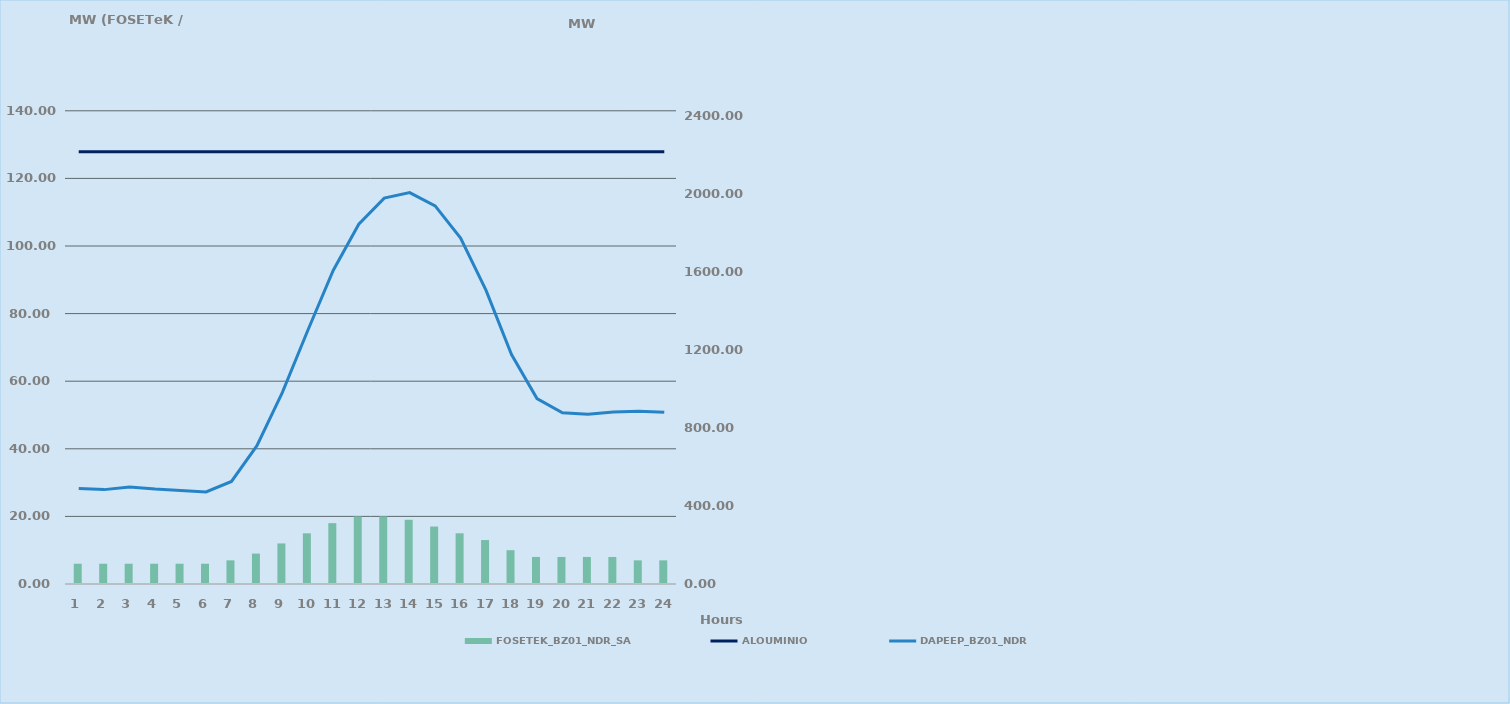
| Category | FOSETEK_BZ01_NDR_SA |
|---|---|
| 0 | 6 |
| 1 | 6 |
| 2 | 6 |
| 3 | 6 |
| 4 | 6 |
| 5 | 6 |
| 6 | 7 |
| 7 | 9 |
| 8 | 12 |
| 9 | 15 |
| 10 | 18 |
| 11 | 20 |
| 12 | 20 |
| 13 | 19 |
| 14 | 17 |
| 15 | 15 |
| 16 | 13 |
| 17 | 10 |
| 18 | 8 |
| 19 | 8 |
| 20 | 8 |
| 21 | 8 |
| 22 | 7 |
| 23 | 7 |